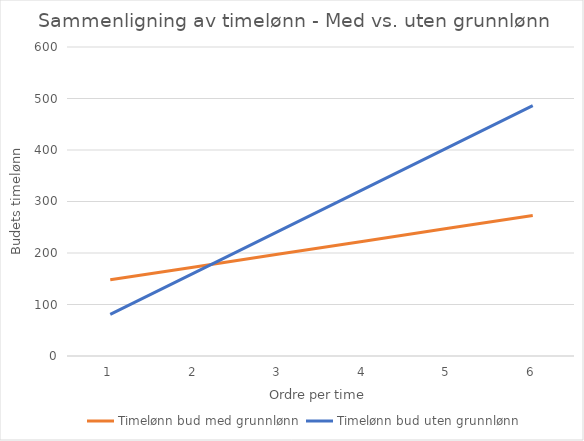
| Category | Timelønn bud med grunnlønn | Timelønn bud uten grunnlønn |
|---|---|---|
| 0 | 148 | 81 |
| 1 | 173 | 162 |
| 2 | 198 | 243 |
| 3 | 223 | 324 |
| 4 | 248 | 405 |
| 5 | 273 | 486 |